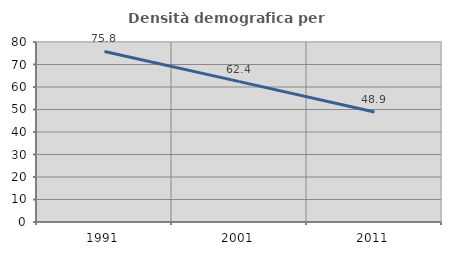
| Category | Densità demografica |
|---|---|
| 1991.0 | 75.806 |
| 2001.0 | 62.389 |
| 2011.0 | 48.891 |